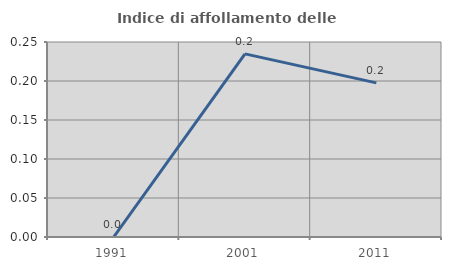
| Category | Indice di affollamento delle abitazioni  |
|---|---|
| 1991.0 | 0 |
| 2001.0 | 0.235 |
| 2011.0 | 0.198 |